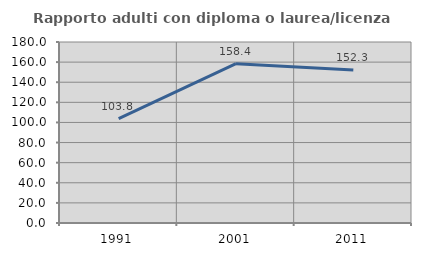
| Category | Rapporto adulti con diploma o laurea/licenza media  |
|---|---|
| 1991.0 | 103.75 |
| 2001.0 | 158.427 |
| 2011.0 | 152.252 |